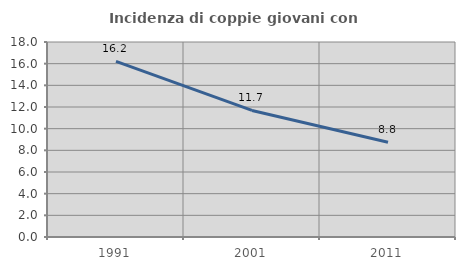
| Category | Incidenza di coppie giovani con figli |
|---|---|
| 1991.0 | 16.209 |
| 2001.0 | 11.685 |
| 2011.0 | 8.753 |